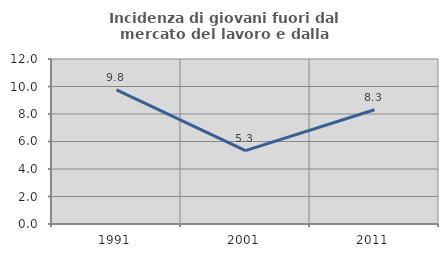
| Category | Incidenza di giovani fuori dal mercato del lavoro e dalla formazione  |
|---|---|
| 1991.0 | 9.75 |
| 2001.0 | 5.338 |
| 2011.0 | 8.306 |